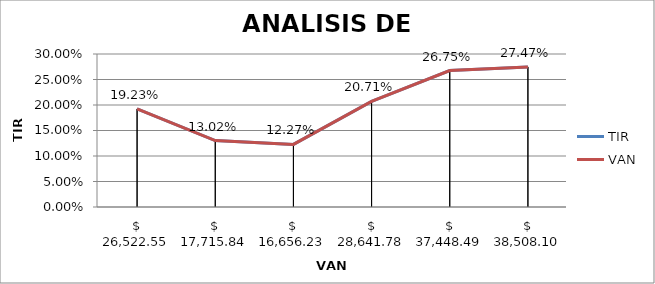
| Category | TIR | VAN |
|---|---|---|
| 26522.55 | 0.192 | 0.192 |
| 17715.84 | 0.13 | 0.13 |
| 16656.23 | 0.123 | 0.123 |
| 28641.78 | 0.207 | 0.207 |
| 37448.49 | 0.268 | 0.268 |
| 38508.1 | 0.275 | 0.275 |